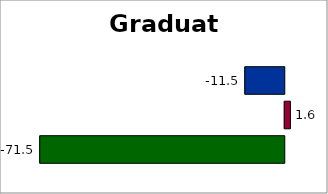
| Category | Series 2 | SREB states | 50 states and D.C. |
|---|---|---|---|
| 0 | -71.462 | 1.645 | -11.535 |